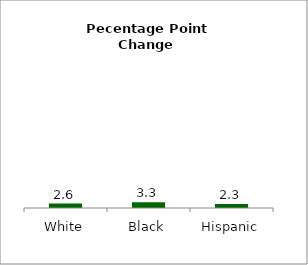
| Category | Series 0 |
|---|---|
| White | 2.631 |
| Black | 3.334 |
| Hispanic | 2.307 |